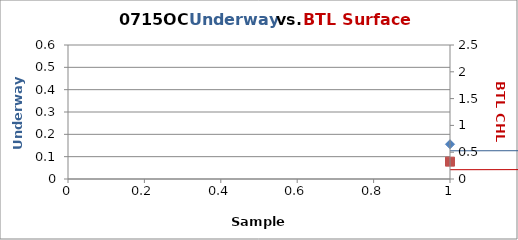
| Category |  FL |
|---|---|
| 0 | 0.156 |
| 1 | 0.231 |
| 2 | 0.143 |
| 3 | 0.172 |
| 4 | 0.14 |
| 5 | 0.152 |
| 6 | 0.163 |
| 7 | 0.116 |
| 8 | 0.135 |
| 9 | 0.125 |
| 10 | 0.102 |
| 11 | 0.105 |
| 12 | 0.111 |
| 13 | 0.11 |
| 14 | 0.11 |
| 15 | 0.119 |
| 16 | 0.11 |
| 17 | 0.136 |
| 18 | 0.1 |
| 19 | 0.106 |
| 20 | 0.112 |
| 21 | 0.176 |
| 22 | 0.14 |
| 23 | 0.185 |
| 24 | 0.177 |
| 25 | 0.167 |
| 26 | 0.172 |
| 27 | 0.18 |
| 28 | 0.204 |
| 29 | 0.544 |
| 30 | 0.129 |
| 31 | 0.261 |
| 32 | 0.267 |
| 33 | 0.186 |
| 34 | 0.417 |
| 35 | 0.386 |
| 36 | 0.303 |
| 37 | 0.402 |
| 38 | 0.262 |
| 39 | 0.178 |
| 40 | 0.148 |
| 41 | 0.382 |
| 42 | 0.11 |
| 43 | 0.121 |
| 44 | 0.122 |
| 45 | 0.105 |
| 46 | 0.122 |